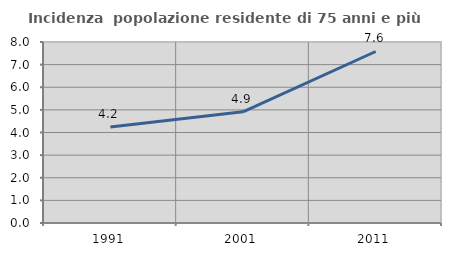
| Category | Incidenza  popolazione residente di 75 anni e più |
|---|---|
| 1991.0 | 4.239 |
| 2001.0 | 4.912 |
| 2011.0 | 7.58 |